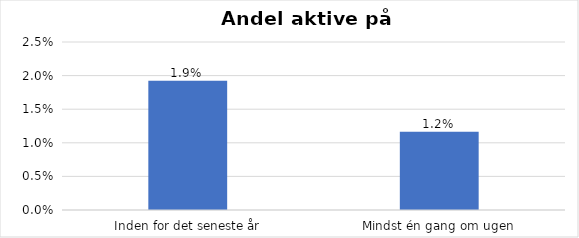
| Category | % |
|---|---|
| Inden for det seneste år | 0.019 |
| Mindst én gang om ugen | 0.012 |